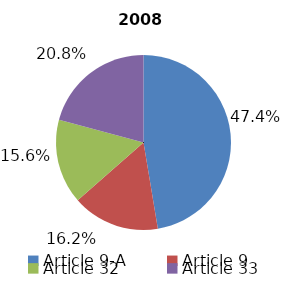
| Category | 2008 |
|---|---|
| Article 9-A | 2196632268.36 |
| Article 9 | 749409321 |
| Article 32 | 725196371 |
| Article 33 | 965418568 |